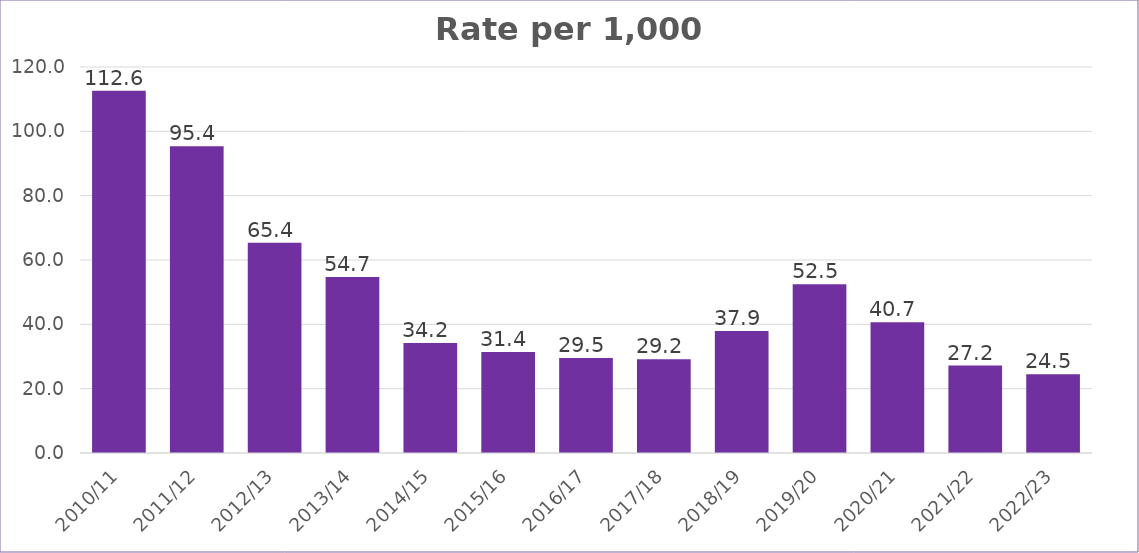
| Category | Series 0 |
|---|---|
| 2010/11 | 112.636 |
| 2011/12 | 95.367 |
| 2012/13 | 65.376 |
| 2013/14 | 54.713 |
| 2014/15 | 34.16 |
| 2015/16 | 31.409 |
| 2016/17 | 29.519 |
| 2017/18 | 29.168 |
| 2018/19 | 37.939 |
| 2019/20 | 52.475 |
| 2020/21 | 40.672 |
| 2021/22 | 27.167 |
| 2022/23 | 24.484 |